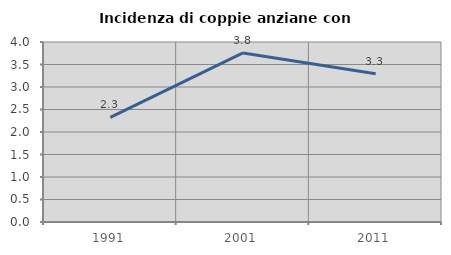
| Category | Incidenza di coppie anziane con figli |
|---|---|
| 1991.0 | 2.326 |
| 2001.0 | 3.758 |
| 2011.0 | 3.293 |